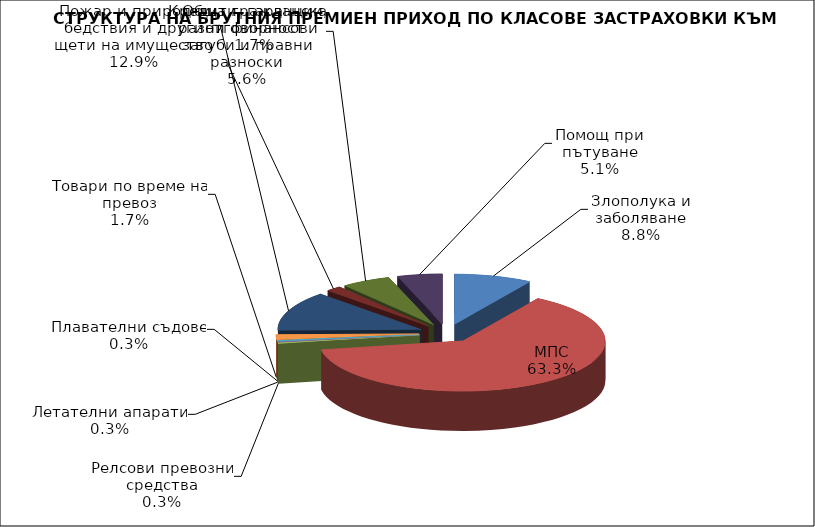
| Category | Злополука и заболяване |
|---|---|
| Злополука и заболяване | 0.088 |
| МПС | 0.633 |
| Релсови превозни средства | 0.003 |
| Летателни апарати | 0.003 |
| Плавателни съдове | 0.003 |
| Товари по време на превоз | 0.017 |
| Пожар и природни бедствия и други щети на имущество | 0.129 |
| Обща гражданска отговорност | 0.017 |
| Кредити, гаранции, разни финансови загуби и правни разноски | 0.056 |
| Помощ при пътуване | 0.051 |